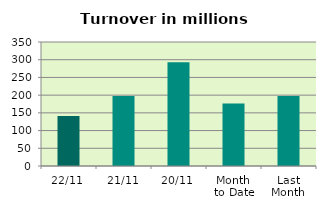
| Category | Series 0 |
|---|---|
| 22/11 | 141.315 |
| 21/11 | 197.333 |
| 20/11 | 292.529 |
| Month 
to Date | 176.493 |
| Last
Month | 197.652 |